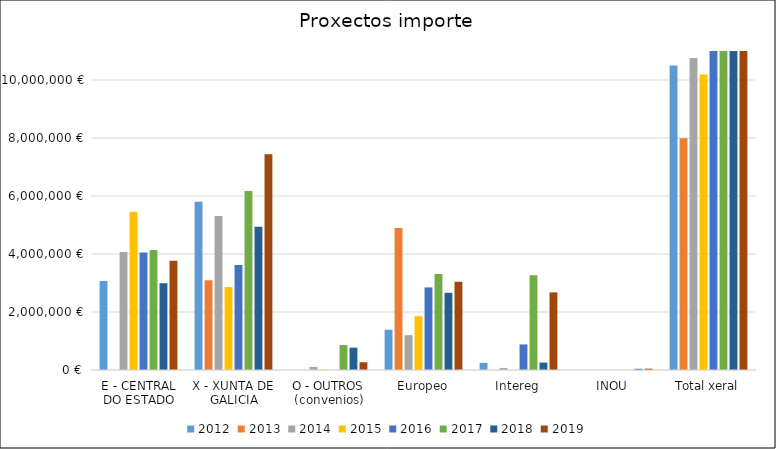
| Category | 2012 | 2013 | 2014 | 2015 | 2016 | 2017 | 2018 | 2019 |
|---|---|---|---|---|---|---|---|---|
| E - CENTRAL DO ESTADO | 3072197 | 0 | 4069609.34 | 5456349.24 | 4049876 | 4140299 | 2987610.18 | 3771337.98 |
| X - XUNTA DE GALICIA | 5797841.07 | 3097800 | 5312000 | 2860000 | 3619814.03 | 6170452 | 4942312.48 | 7441999 |
| O - OUTROS (convenios) | 0 | 0 | 108000 | 19954.57 | 0 | 860997 | 770257.84 | 267000 |
| Europeo | 1388722.22 | 4893072.39 | 1201045.6 | 1855568.5 | 2848255 | 3310824 | 2662542.94 | 3047283.99 |
| Intereg | 244400 | 0 | 72020 | 0 | 881250 | 3268859 | 255537 | 2675859.7 |
| INOU | 0 | 0 | 0 | 0 | 0 | 0 | 40425 | 46200 |
| Total xeral | 10503160.29 | 7990872.39 | 10762674.94 | 10191872.31 | 11399195.03 | 17751431 | 11658685.44 | 17249680.67 |